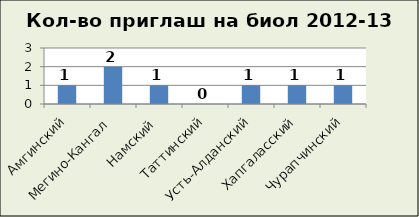
| Category | биол |
|---|---|
| Амгинский | 1 |
| Мегино-Кангал | 2 |
| Намский | 1 |
| Таттинский | 0 |
| Усть-Алданский | 1 |
| Хапгаласский | 1 |
| Чурапчинский | 1 |